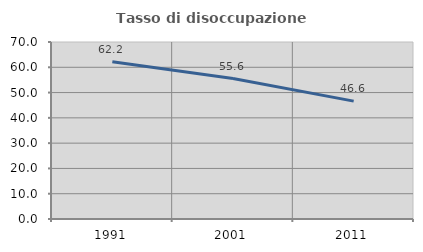
| Category | Tasso di disoccupazione giovanile  |
|---|---|
| 1991.0 | 62.195 |
| 2001.0 | 55.556 |
| 2011.0 | 46.622 |